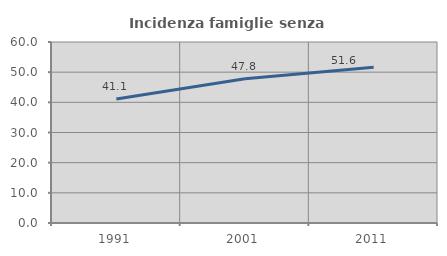
| Category | Incidenza famiglie senza nuclei |
|---|---|
| 1991.0 | 41.114 |
| 2001.0 | 47.798 |
| 2011.0 | 51.62 |